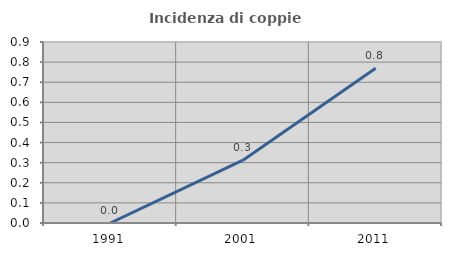
| Category | Incidenza di coppie miste |
|---|---|
| 1991.0 | 0 |
| 2001.0 | 0.312 |
| 2011.0 | 0.769 |